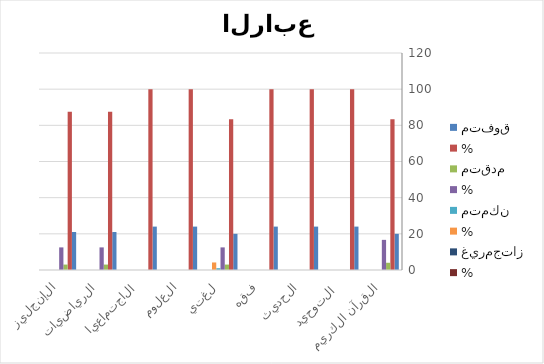
| Category | متفوق | % | متقدم | متمكن | غيرمجتاز |
|---|---|---|---|---|---|
| القرآن الكريم | 20 | 0 | 4 | 0 | 0 |
| التوحيد  | 24 | 0 | 0 | 0 | 0 |
| الحديث | 24 | 0 | 0 | 0 | 0 |
| فقه | 24 | 0 | 0 | 0 | 0 |
| لغتي | 20 | 0 | 3 | 1 | 0 |
| العلوم | 24 | 0 | 0 | 0 | 0 |
| الاجتماعيات | 24 | 0 | 0 | 0 | 0 |
| الرياضيات | 21 | 0 | 3 | 0 | 0 |
| الإنجليزي | 21 | 0 | 3 | 0 | 0 |